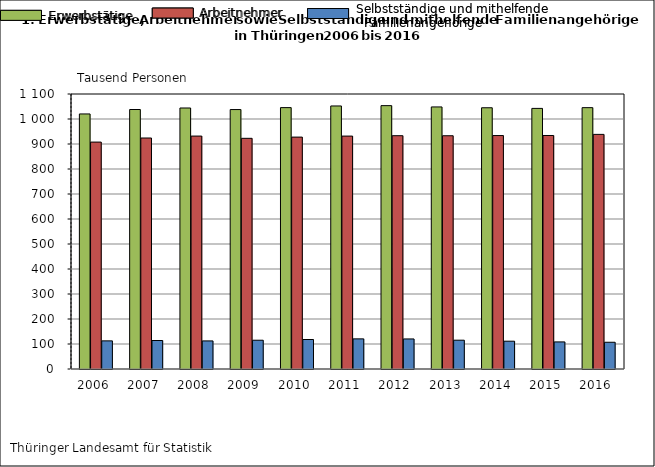
| Category | Erwerbstätige | Arbeitnehmer | Selbstständige
und mithelfende
Familienangehörige |
|---|---|---|---|
| 2006.0 | 1020.217 | 907.675 | 112.542 |
| 2007.0 | 1037.958 | 923.973 | 113.985 |
| 2008.0 | 1044.036 | 931.694 | 112.342 |
| 2009.0 | 1037.778 | 922.691 | 115.087 |
| 2010.0 | 1045.55 | 927.601 | 117.949 |
| 2011.0 | 1052.163 | 931.655 | 120.508 |
| 2012.0 | 1053.466 | 933.24 | 120.226 |
| 2013.0 | 1048.289 | 933.062 | 115.227 |
| 2014.0 | 1044.984 | 933.777 | 111.207 |
| 2015.0 | 1042.376 | 934.054 | 108.322 |
| 2016.0 | 1045.402 | 938.441 | 106.961 |